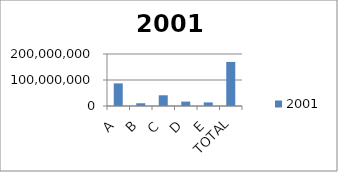
| Category | 2001 |
|---|---|
| A | 86929250 |
| B | 10561250 |
| C | 41201750 |
| D | 16940000 |
| E | 13844200 |
| TOTAL | 169478451 |